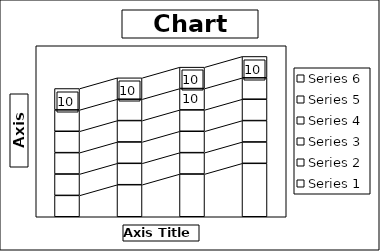
| Category | Series 1 | Series 2 | Series 3 | Series 4 | Series 5 | Series 6 |
|---|---|---|---|---|---|---|
| Point 1 | 10 | 10 | 10 | 10 | 10 | 10 |
| Point 2 | 15 | 10 | 10 | 10 | 10 | 10 |
| Point 3 | 20 | 10 | 10 | 10 | 10 | 10 |
| Point 4 | 25 | 10 | 10 | 10 | 10 | 10 |